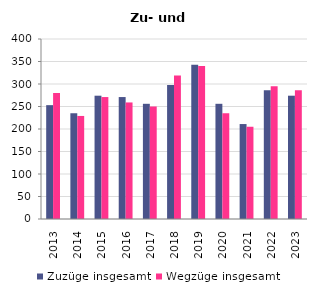
| Category | Zuzüge insgesamt | Wegzüge insgesamt |
|---|---|---|
| 2013.0 | 253 | 280 |
| 2014.0 | 235 | 229 |
| 2015.0 | 274 | 271 |
| 2016.0 | 271 | 259 |
| 2017.0 | 256 | 250 |
| 2018.0 | 298 | 319 |
| 2019.0 | 343 | 340 |
| 2020.0 | 256 | 235 |
| 2021.0 | 211 | 205 |
| 2022.0 | 286 | 295 |
| 2023.0 | 274 | 286 |